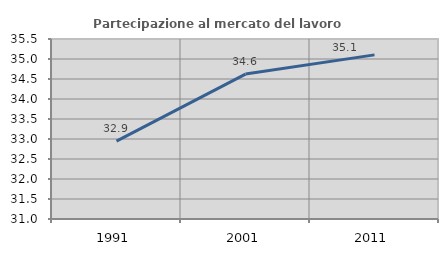
| Category | Partecipazione al mercato del lavoro  femminile |
|---|---|
| 1991.0 | 32.947 |
| 2001.0 | 34.623 |
| 2011.0 | 35.103 |